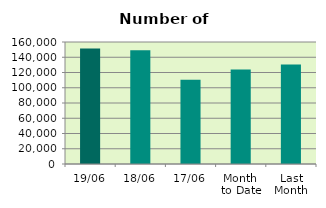
| Category | Series 0 |
|---|---|
| 19/06 | 151520 |
| 18/06 | 149266 |
| 17/06 | 110434 |
| Month 
to Date | 123992.615 |
| Last
Month | 130647.636 |